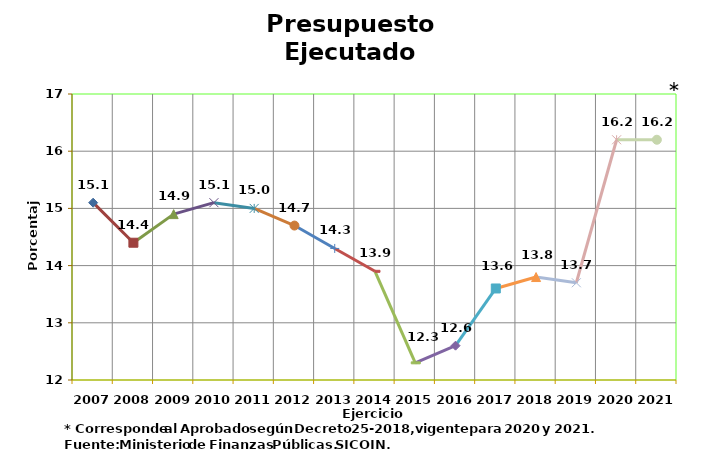
| Category | Series 0 |
|---|---|
| 2007 | 15.1 |
| 2008 | 14.4 |
| 2009 | 14.9 |
| 2010 | 15.1 |
| 2011 | 15 |
| 2012 | 14.7 |
| 2013 | 14.3 |
| 2014 | 13.9 |
| 2015 | 12.3 |
| 2016 | 12.6 |
| 2017 | 13.6 |
| 2018 | 13.8 |
| 2019 | 13.7 |
| 2020 | 16.2 |
| 2021 | 16.2 |